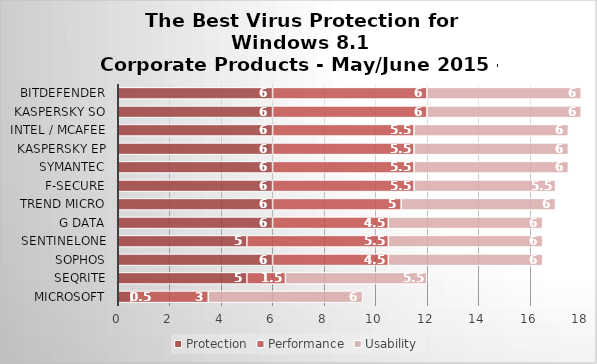
| Category | Protection | Performance | Usability |
|---|---|---|---|
| Microsoft | 0.5 | 3 | 6 |
| Seqrite | 5 | 1.5 | 5.5 |
| Sophos | 6 | 4.5 | 6 |
| SentinelOne | 5 | 5.5 | 6 |
| G Data | 6 | 4.5 | 6 |
| Trend Micro | 6 | 5 | 6 |
| F-Secure | 6 | 5.5 | 5.5 |
| Symantec | 6 | 5.5 | 6 |
| Kaspersky EP | 6 | 5.5 | 6 |
| Intel / McAfee | 6 | 5.5 | 6 |
| Kaspersky SO | 6 | 6 | 6 |
| Bitdefender | 6 | 6 | 6 |